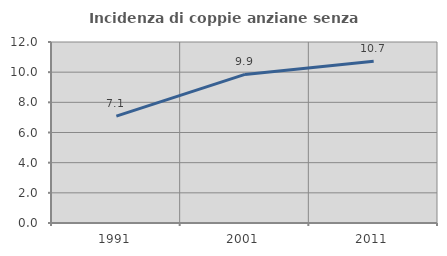
| Category | Incidenza di coppie anziane senza figli  |
|---|---|
| 1991.0 | 7.084 |
| 2001.0 | 9.85 |
| 2011.0 | 10.726 |